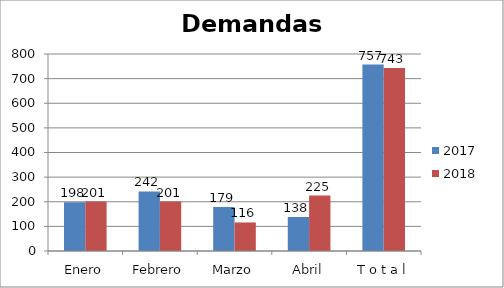
| Category | 2017 | 2018 |
|---|---|---|
| Enero | 198 | 201 |
| Febrero | 242 | 201 |
| Marzo | 179 | 116 |
| Abril | 138 | 225 |
| T o t a l | 757 | 743 |